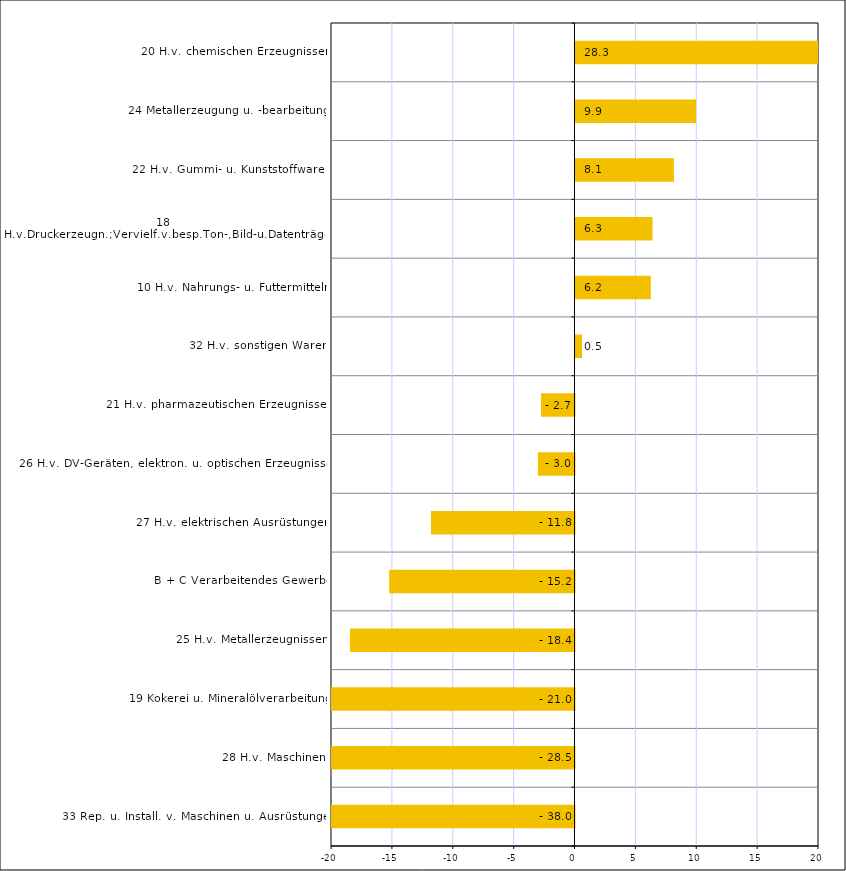
| Category | Series 0 |
|---|---|
| 33 Rep. u. Install. v. Maschinen u. Ausrüstungen | -38.019 |
| 28 H.v. Maschinen | -28.492 |
| 19 Kokerei u. Mineralölverarbeitung | -21.006 |
| 25 H.v. Metallerzeugnissen | -18.448 |
| B + C Verarbeitendes Gewerbe | -15.226 |
| 27 H.v. elektrischen Ausrüstungen | -11.788 |
| 26 H.v. DV-Geräten, elektron. u. optischen Erzeugnissen | -3.008 |
| 21 H.v. pharmazeutischen Erzeugnissen | -2.749 |
| 32 H.v. sonstigen Waren | 0.541 |
| 10 H.v. Nahrungs- u. Futtermitteln | 6.187 |
| 18 H.v.Druckerzeugn.;Vervielf.v.besp.Ton-,Bild-u.Datenträgern | 6.332 |
| 22 H.v. Gummi- u. Kunststoffwaren | 8.084 |
| 24 Metallerzeugung u. -bearbeitung | 9.9 |
| 20 H.v. chemischen Erzeugnissen | 28.343 |